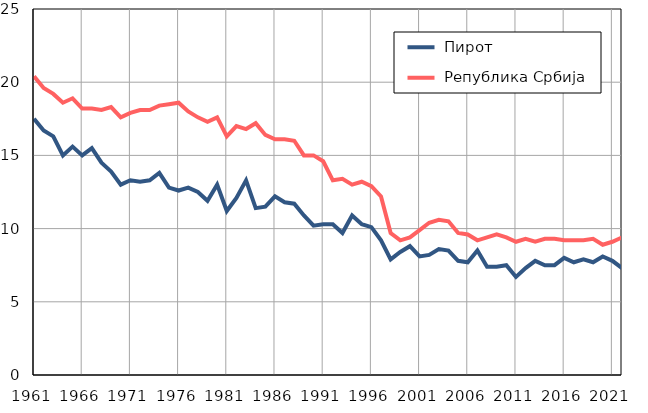
| Category |  Пирот |  Република Србија |
|---|---|---|
| 1961.0 | 17.5 | 20.4 |
| 1962.0 | 16.7 | 19.6 |
| 1963.0 | 16.3 | 19.2 |
| 1964.0 | 15 | 18.6 |
| 1965.0 | 15.6 | 18.9 |
| 1966.0 | 15 | 18.2 |
| 1967.0 | 15.5 | 18.2 |
| 1968.0 | 14.5 | 18.1 |
| 1969.0 | 13.9 | 18.3 |
| 1970.0 | 13 | 17.6 |
| 1971.0 | 13.3 | 17.9 |
| 1972.0 | 13.2 | 18.1 |
| 1973.0 | 13.3 | 18.1 |
| 1974.0 | 13.8 | 18.4 |
| 1975.0 | 12.8 | 18.5 |
| 1976.0 | 12.6 | 18.6 |
| 1977.0 | 12.8 | 18 |
| 1978.0 | 12.5 | 17.6 |
| 1979.0 | 11.9 | 17.3 |
| 1980.0 | 13 | 17.6 |
| 1981.0 | 11.2 | 16.3 |
| 1982.0 | 12.1 | 17 |
| 1983.0 | 13.3 | 16.8 |
| 1984.0 | 11.4 | 17.2 |
| 1985.0 | 11.5 | 16.4 |
| 1986.0 | 12.2 | 16.1 |
| 1987.0 | 11.8 | 16.1 |
| 1988.0 | 11.7 | 16 |
| 1989.0 | 10.9 | 15 |
| 1990.0 | 10.2 | 15 |
| 1991.0 | 10.3 | 14.6 |
| 1992.0 | 10.3 | 13.3 |
| 1993.0 | 9.7 | 13.4 |
| 1994.0 | 10.9 | 13 |
| 1995.0 | 10.3 | 13.2 |
| 1996.0 | 10.1 | 12.9 |
| 1997.0 | 9.2 | 12.2 |
| 1998.0 | 7.9 | 9.7 |
| 1999.0 | 8.4 | 9.2 |
| 2000.0 | 8.8 | 9.4 |
| 2001.0 | 8.1 | 9.9 |
| 2002.0 | 8.2 | 10.4 |
| 2003.0 | 8.6 | 10.6 |
| 2004.0 | 8.5 | 10.5 |
| 2005.0 | 7.8 | 9.7 |
| 2006.0 | 7.7 | 9.6 |
| 2007.0 | 8.5 | 9.2 |
| 2008.0 | 7.4 | 9.4 |
| 2009.0 | 7.4 | 9.6 |
| 2010.0 | 7.5 | 9.4 |
| 2011.0 | 6.7 | 9.1 |
| 2012.0 | 7.3 | 9.3 |
| 2013.0 | 7.8 | 9.1 |
| 2014.0 | 7.5 | 9.3 |
| 2015.0 | 7.5 | 9.3 |
| 2016.0 | 8 | 9.2 |
| 2017.0 | 7.7 | 9.2 |
| 2018.0 | 7.9 | 9.2 |
| 2019.0 | 7.7 | 9.3 |
| 2020.0 | 8.1 | 8.9 |
| 2021.0 | 7.8 | 9.1 |
| 2022.0 | 7.3 | 9.4 |